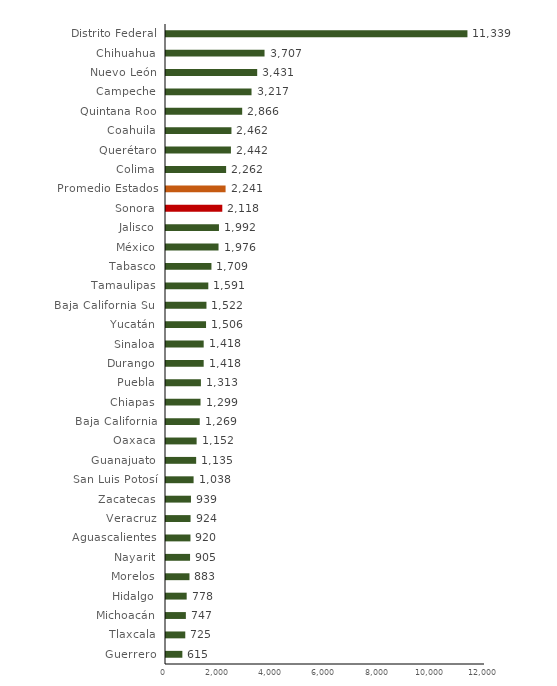
| Category | Recaudación percápita |
|---|---|
| Guerrero | 615.421 |
| Tlaxcala | 724.916 |
| Michoacán | 747.059 |
| Hidalgo | 778.002 |
| Morelos | 882.991 |
| Nayarit | 905.08 |
| Aguascalientes | 919.949 |
| Veracruz | 924.043 |
| Zacatecas | 938.705 |
| San Luis Potosí | 1037.803 |
| Guanajuato | 1134.646 |
| Oaxaca | 1152.087 |
| Baja California | 1268.741 |
| Chiapas | 1299.075 |
| Puebla | 1313.459 |
| Durango | 1417.545 |
| Sinaloa | 1417.672 |
| Yucatán | 1506.396 |
| Baja California Sur | 1521.909 |
| Tamaulipas | 1591.425 |
| Tabasco | 1709.334 |
| México | 1975.992 |
| Jalisco | 1992.122 |
| Sonora | 2117.688 |
| Promedio Estados | 2241.33 |
| Colima | 2261.563 |
| Querétaro | 2442.394 |
| Coahuila | 2461.908 |
| Quintana Roo | 2865.869 |
| Campeche | 3217.327 |
| Nuevo León | 3430.689 |
| Chihuahua | 3706.682 |
| Distrito Federal | 11339.437 |